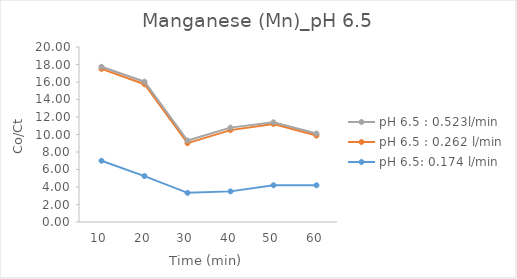
| Category | pH 6.5: 0.174 l/min | pH 6.5 : 0.262 l/min | pH 6.5 : 0.523l/min |
|---|---|---|---|
| 10.0 | 7 | 10.5 | 0.238 |
| 20.0 | 5.25 | 10.5 | 0.286 |
| 30.0 | 3.333 | 5.676 | 0.3 |
| 40.0 | 3.5 | 7 | 0.286 |
| 50.0 | 4.2 | 7 | 0.19 |
| 60.0 | 4.2 | 5.676 | 0.238 |